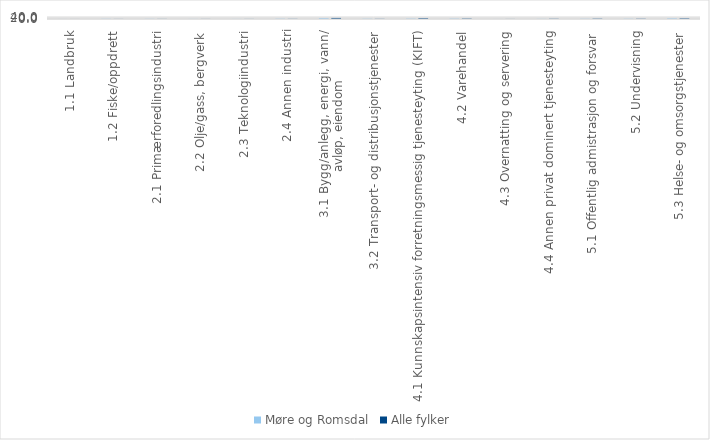
| Category | Møre og Romsdal | Alle fylker |
|---|---|---|
| 1.1 Landbruk | 0.989 | 0.814 |
| 1.2 Fiske/oppdrett | 5.009 | 1.732 |
| 2.1 Primærforedlingsindustri | 4.309 | 2.443 |
| 2.2 Olje/gass, bergverk | 1.905 | 2.052 |
| 2.3 Teknologiindustri | 2.351 | 1.926 |
| 2.4 Annen industri | 7.305 | 3.764 |
| 3.1 Bygg/anlegg, energi, vann/
avløp, eiendom | 19.622 | 21.135 |
| 3.2 Transport- og distribusjonstjenester | 6.947 | 4.233 |
| 4.1 Kunnskapsintensiv forretningsmessig tjenesteyting (KIFT) | 9.659 | 16.953 |
| 4.2 Varehandel | 9.61 | 9.688 |
| 4.3 Overnatting og servering | 1.281 | 1.718 |
| 4.4 Annen privat dominert tjenesteyting | 3.88 | 5.772 |
| 5.1 Offentlig admistrasjon og forsvar | 5.625 | 8.035 |
| 5.2 Undervisning | 6.057 | 6.39 |
| 5.3 Helse- og omsorgstjenester | 15.451 | 13.343 |